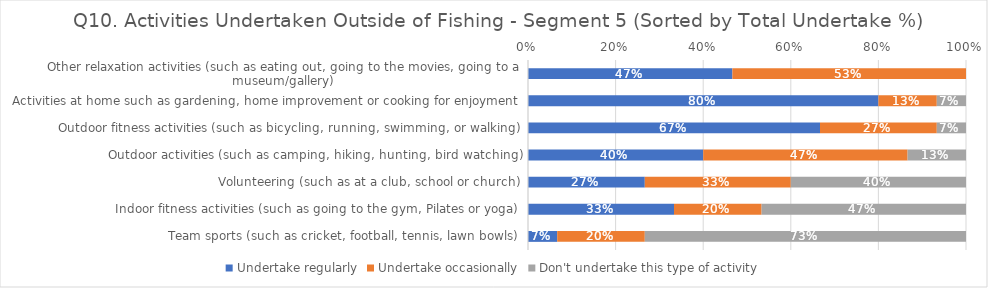
| Category | Undertake regularly | Undertake occasionally | Don't undertake this type of activity |
|---|---|---|---|
| Other relaxation activities (such as eating out, going to the movies, going to a museum/gallery) | 0.467 | 0.533 | 0 |
| Activities at home such as gardening, home improvement or cooking for enjoyment | 0.8 | 0.133 | 0.067 |
| Outdoor fitness activities (such as bicycling, running, swimming, or walking) | 0.667 | 0.267 | 0.067 |
| Outdoor activities (such as camping, hiking, hunting, bird watching) | 0.4 | 0.467 | 0.133 |
| Volunteering (such as at a club, school or church) | 0.267 | 0.333 | 0.4 |
| Indoor fitness activities (such as going to the gym, Pilates or yoga) | 0.333 | 0.2 | 0.467 |
| Team sports (such as cricket, football, tennis, lawn bowls) | 0.067 | 0.2 | 0.733 |